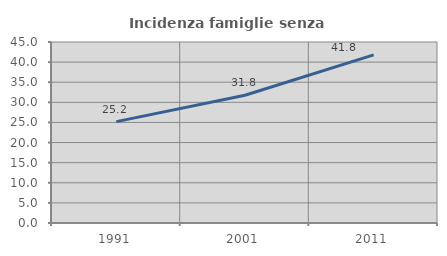
| Category | Incidenza famiglie senza nuclei |
|---|---|
| 1991.0 | 25.209 |
| 2001.0 | 31.774 |
| 2011.0 | 41.808 |